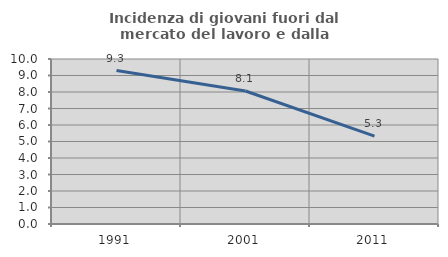
| Category | Incidenza di giovani fuori dal mercato del lavoro e dalla formazione  |
|---|---|
| 1991.0 | 9.302 |
| 2001.0 | 8.06 |
| 2011.0 | 5.323 |